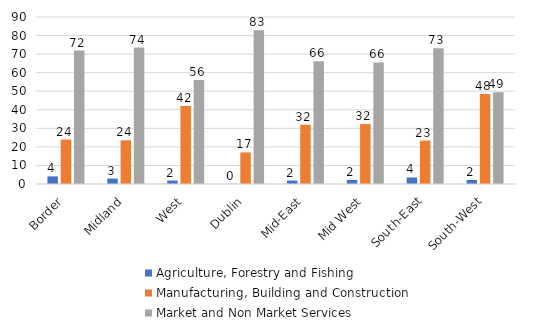
| Category | Agriculture, Forestry and Fishing  | Manufacturing, Building and Construction | Market and Non Market Services |
|---|---|---|---|
| Border | 4.115 | 23.942 | 71.943 |
| Midland | 2.936 | 23.527 | 73.536 |
| West | 1.883 | 42.076 | 56.041 |
| Dublin | 0.077 | 17.03 | 82.894 |
| Mid-East | 1.871 | 31.968 | 66.16 |
| Mid West | 2.179 | 32.297 | 65.524 |
| South-East | 3.514 | 23.393 | 73.093 |
| South-West | 2.168 | 48.447 | 49.385 |